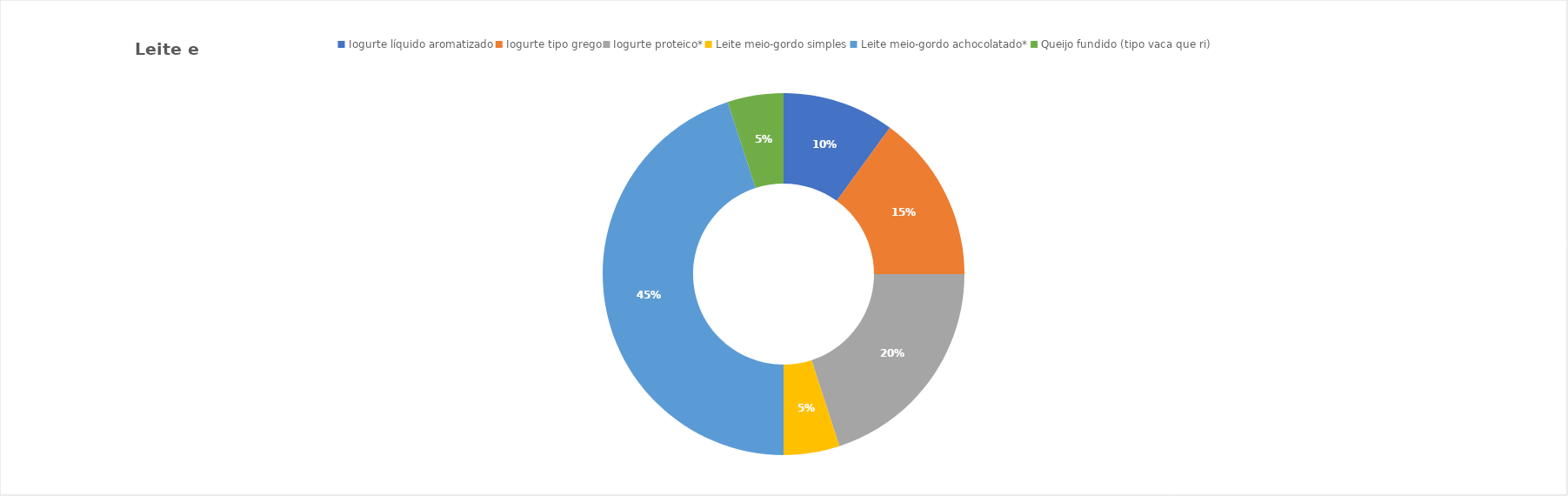
| Category | nº de respostas |
|---|---|
| Iogurte líquido aromatizado | 2 |
| Iogurte tipo grego | 3 |
| Iogurte proteico* | 4 |
| Leite meio-gordo simples | 1 |
| Leite meio-gordo achocolatado* | 9 |
| Queijo fundido (tipo vaca que ri) | 1 |